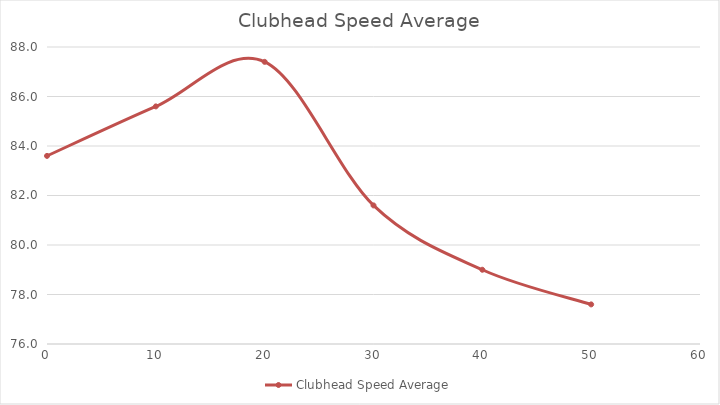
| Category | Clubhead Speed Average |
|---|---|
| 0.0 | 83.6 |
| 10.0 | 85.6 |
| 20.0 | 87.4 |
| 30.0 | 81.6 |
| 40.0 | 79 |
| 50.0 | 77.6 |